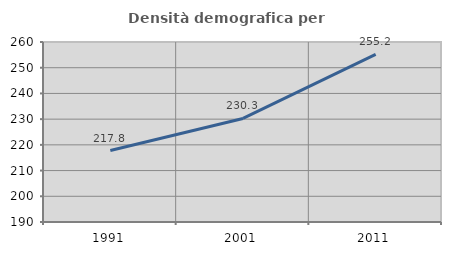
| Category | Densità demografica |
|---|---|
| 1991.0 | 217.799 |
| 2001.0 | 230.26 |
| 2011.0 | 255.182 |